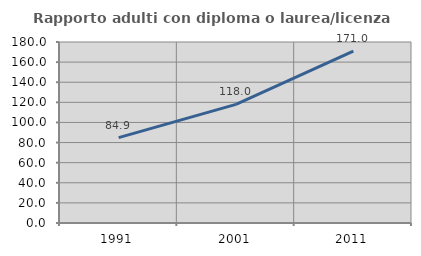
| Category | Rapporto adulti con diploma o laurea/licenza media  |
|---|---|
| 1991.0 | 84.854 |
| 2001.0 | 117.984 |
| 2011.0 | 170.983 |